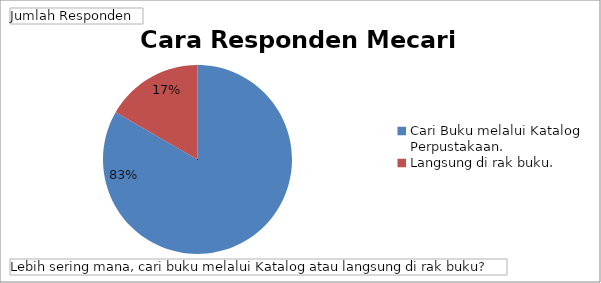
| Category | Total |
|---|---|
| Cari Buku melalui Katalog Perpustakaan. | 65 |
| Langsung di rak buku. | 13 |